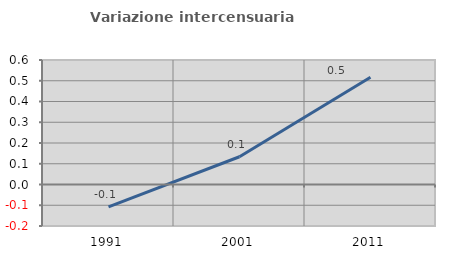
| Category | Variazione intercensuaria annua |
|---|---|
| 1991.0 | -0.107 |
| 2001.0 | 0.134 |
| 2011.0 | 0.517 |